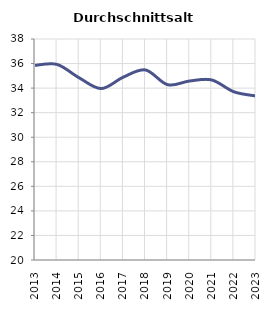
| Category | Durchschnittsalter |
|---|---|
| 2013.0 | 35.853 |
| 2014.0 | 35.927 |
| 2015.0 | 34.835 |
| 2016.0 | 33.964 |
| 2017.0 | 34.897 |
| 2018.0 | 35.477 |
| 2019.0 | 34.277 |
| 2020.0 | 34.58 |
| 2021.0 | 34.662 |
| 2022.0 | 33.7 |
| 2023.0 | 33.359 |